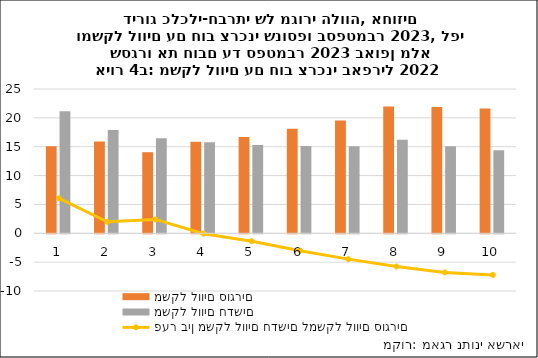
| Category | משקל לווים סוגרים | משקל לווים חדשים |
|---|---|---|
| 1.0 | 15.088 | 21.144 |
| 2.0 | 15.897 | 17.89 |
| 3.0 | 14.048 | 16.45 |
| 4.0 | 15.852 | 15.782 |
| 5.0 | 16.666 | 15.284 |
| 6.0 | 18.126 | 15.115 |
| 7.0 | 19.554 | 15.077 |
| 8.0 | 21.959 | 16.206 |
| 9.0 | 21.871 | 15.092 |
| 10.0 | 21.602 | 14.387 |